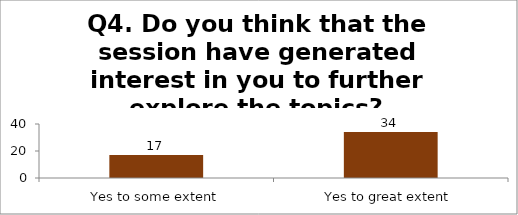
| Category | Q4. Do you think that the session have generated interest in you to further explore the topics? |
|---|---|
| Yes to some extent | 17 |
| Yes to great extent | 34 |